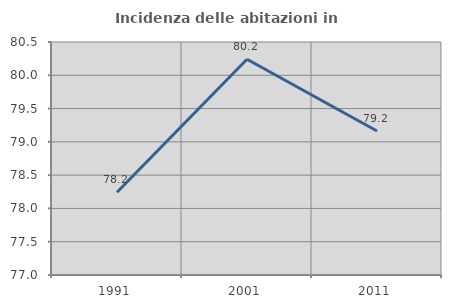
| Category | Incidenza delle abitazioni in proprietà  |
|---|---|
| 1991.0 | 78.242 |
| 2001.0 | 80.241 |
| 2011.0 | 79.163 |